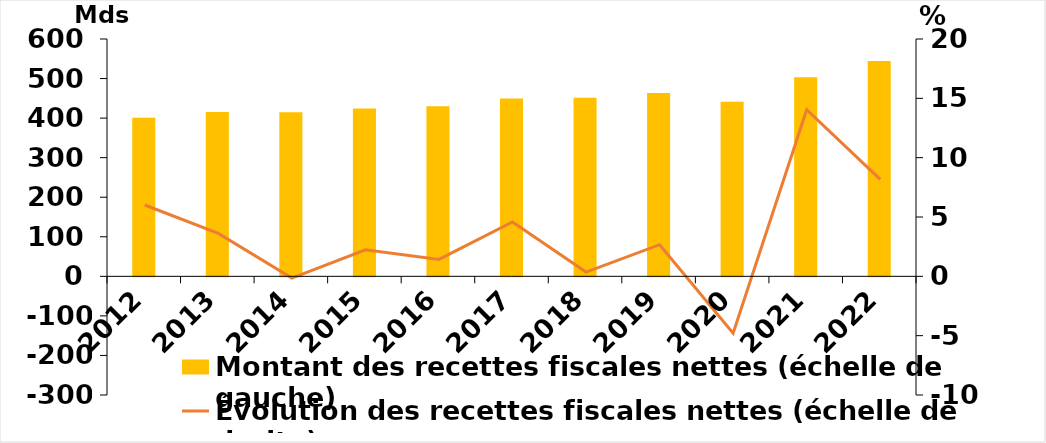
| Category | Montant des recettes fiscales nettes (échelle de gauche) |
|---|---|
| 2012 | 400.939 |
| 2013 | 415.427 |
| 2014 | 414.8 |
| 2015 | 424.08 |
| 2016 | 430.131 |
| 2017 | 449.85 |
| 2018 | 451.48 |
| 2019 | 463.518 |
| 2020 | 441.331 |
| 2021 | 503.303 |
| 2022 | 544.447 |